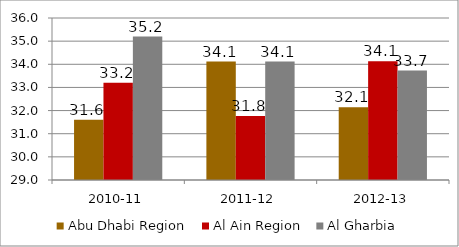
| Category | Abu Dhabi Region  | Al Ain Region  | Al Gharbia |
|---|---|---|---|
| 2010-11 | 31.6 | 33.2 | 35.2 |
| 2011-12 | 34.118 | 31.765 | 34.118 |
| 2012-13 | 32.143 | 34.127 | 33.73 |